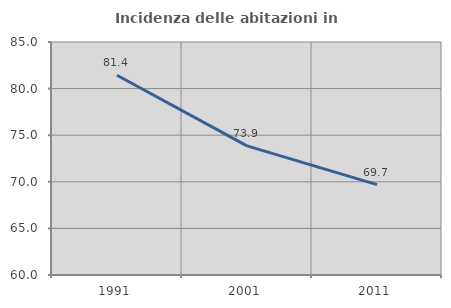
| Category | Incidenza delle abitazioni in proprietà  |
|---|---|
| 1991.0 | 81.429 |
| 2001.0 | 73.853 |
| 2011.0 | 69.697 |